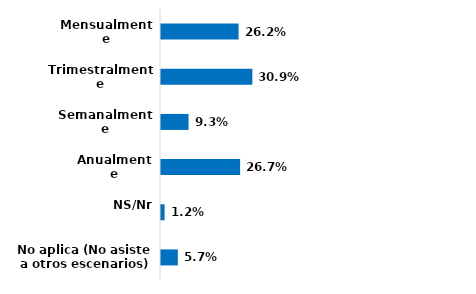
| Category | Series 0 |
|---|---|
| Mensualmente | 0.262 |
| Trimestralmente | 0.309 |
| Semanalmente | 0.093 |
| Anualmente | 0.267 |
| NS/Nr | 0.012 |
| No aplica (No asiste a otros escenarios) | 0.057 |